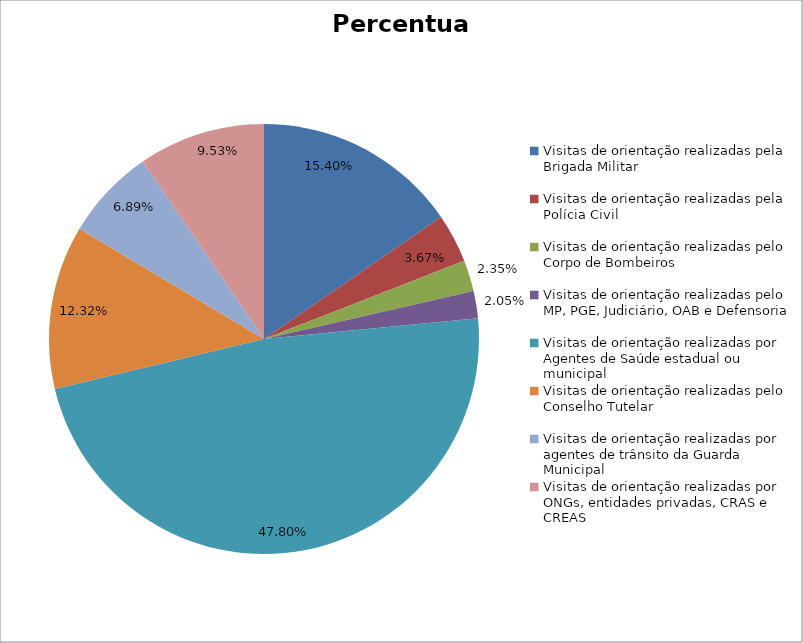
| Category | Percentual |
|---|---|
| Visitas de orientação realizadas pela Brigada Militar | 0.154 |
| Visitas de orientação realizadas pela Polícia Civil | 0.037 |
| Visitas de orientação realizadas pelo Corpo de Bombeiros | 0.023 |
| Visitas de orientação realizadas pelo MP, PGE, Judiciário, OAB e Defensoria | 0.021 |
| Visitas de orientação realizadas por Agentes de Saúde estadual ou municipal | 0.478 |
| Visitas de orientação realizadas pelo Conselho Tutelar | 0.123 |
| Visitas de orientação realizadas por agentes de trânsito da Guarda Municipal | 0.069 |
| Visitas de orientação realizadas por ONGs, entidades privadas, CRAS e CREAS | 0.095 |